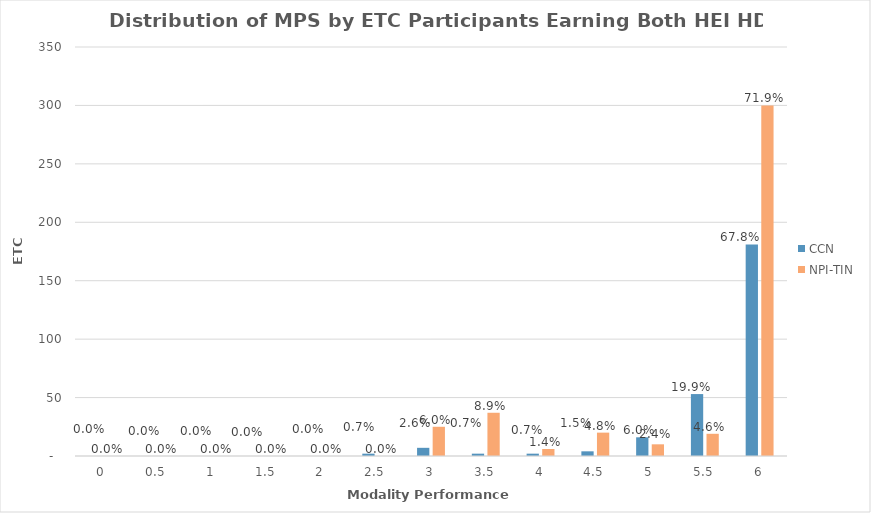
| Category | CCN | NPI-TIN |
|---|---|---|
| 0.0 | 0 | 0 |
| 0.5 | 0 | 0 |
| 1.0 | 0 | 0 |
| 1.5 | 0 | 0 |
| 2.0 | 0 | 0 |
| 2.5 | 2 | 0 |
| 3.0 | 7 | 25 |
| 3.5 | 2 | 37 |
| 4.0 | 2 | 6 |
| 4.5 | 4 | 20 |
| 5.0 | 16 | 10 |
| 5.5 | 53 | 19 |
| 6.0 | 181 | 300 |